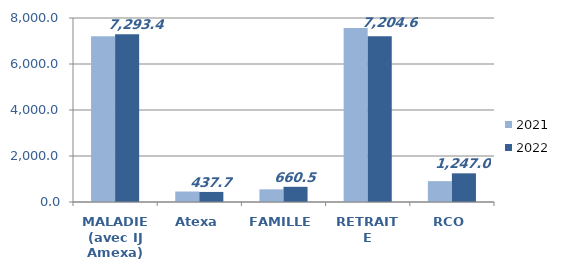
| Category | 2021 | 2022 |
|---|---|---|
| MALADIE (avec IJ Amexa) | 7204.823 | 7293.362 |
| Atexa | 456.18 | 437.727 |
| FAMILLE | 550.845 | 660.464 |
| RETRAITE | 7560.648 | 7204.572 |
| RCO | 906.745 | 1246.973 |